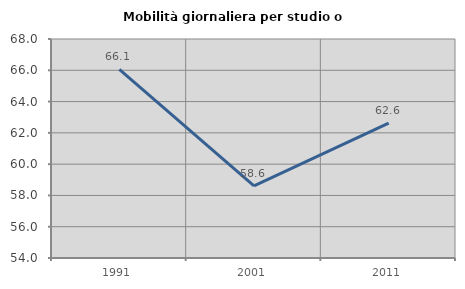
| Category | Mobilità giornaliera per studio o lavoro |
|---|---|
| 1991.0 | 66.051 |
| 2001.0 | 58.615 |
| 2011.0 | 62.618 |